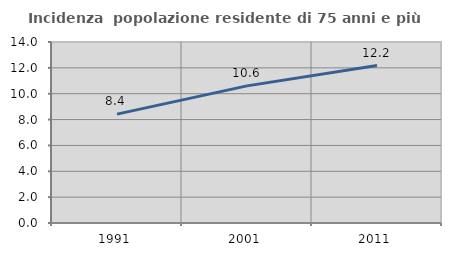
| Category | Incidenza  popolazione residente di 75 anni e più |
|---|---|
| 1991.0 | 8.422 |
| 2001.0 | 10.608 |
| 2011.0 | 12.181 |